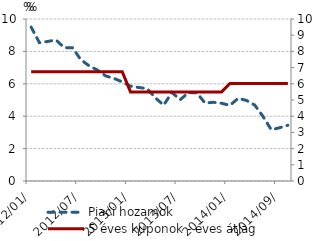
| Category | Piaci hozamok |
|---|---|
| 0 | 9.5 |
| 1900-01-01 | 8.539 |
| 1900-01-02 | 8.613 |
| 1900-01-03 | 8.706 |
| 1900-01-04 | 8.232 |
| 1900-01-05 | 8.22 |
| 1900-01-06 | 7.485 |
| 1900-01-07 | 7.112 |
| 1900-01-08 | 6.848 |
| 1900-01-09 | 6.486 |
| 1900-01-10 | 6.335 |
| 1900-01-11 | 6.117 |
| 1900-01-12 | 5.855 |
| 1900-01-13 | 5.771 |
| 1900-01-14 | 5.708 |
| 1900-01-15 | 5.132 |
| 1900-01-16 | 4.682 |
| 1900-01-17 | 5.464 |
| 1900-01-18 | 5.018 |
| 1900-01-19 | 5.46 |
| 1900-01-20 | 5.443 |
| 1900-01-21 | 4.813 |
| 1900-01-22 | 4.858 |
| 1900-01-23 | 4.798 |
| 1900-01-24 | 4.671 |
| 1900-01-25 | 5.102 |
| 1900-01-26 | 4.975 |
| 1900-01-27 | 4.686 |
| 1900-01-28 | 3.984 |
| 1900-01-29 | 3.164 |
| 1900-01-30 | 3.286 |
| 1900-01-31 | 3.439 |